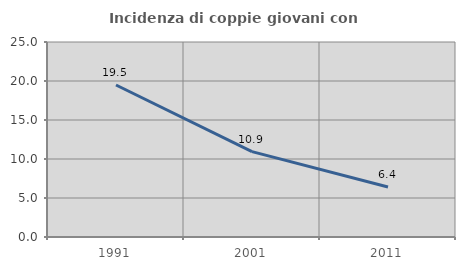
| Category | Incidenza di coppie giovani con figli |
|---|---|
| 1991.0 | 19.484 |
| 2001.0 | 10.942 |
| 2011.0 | 6.404 |